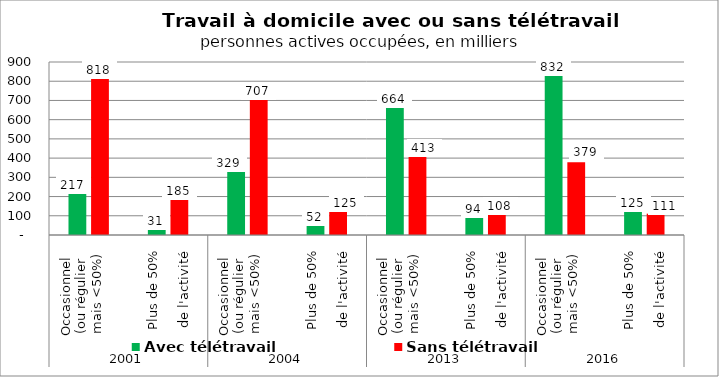
| Category | Avec télétravail | Sans télétravail |
|---|---|---|
| 0 | 217 | 818 |
| 1 | 31 | 185 |
| 2 | 329 | 707 |
| 3 | 52 | 125 |
| 4 | 664 | 413 |
| 5 | 94 | 108 |
| 6 | 832 | 379 |
| 7 | 125 | 111 |